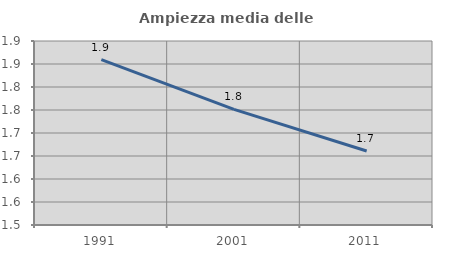
| Category | Ampiezza media delle famiglie |
|---|---|
| 1991.0 | 1.859 |
| 2001.0 | 1.751 |
| 2011.0 | 1.661 |